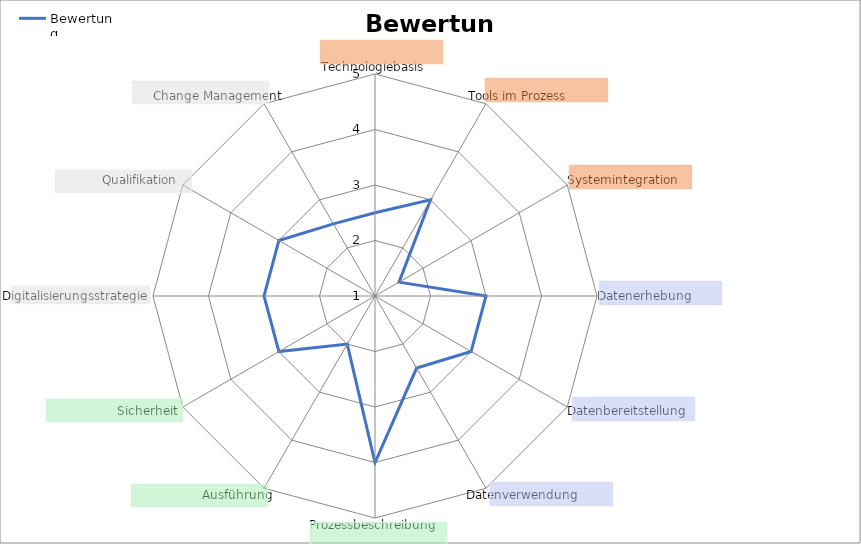
| Category | Bewertung |
|---|---|
| Technologiebasis | 2.5 |
| Tools im Prozess | 3 |
| Systemintegration | 1.5 |
| Datenerhebung | 3 |
| Datenbereitstellung | 3 |
| Datenverwendung | 2.5 |
| Prozessbeschreibung | 4 |
| Ausführung | 2 |
| Sicherheit | 3 |
| Digitalisierungsstrategie | 3 |
| Qualifikation | 3 |
| Change Management | 2.5 |